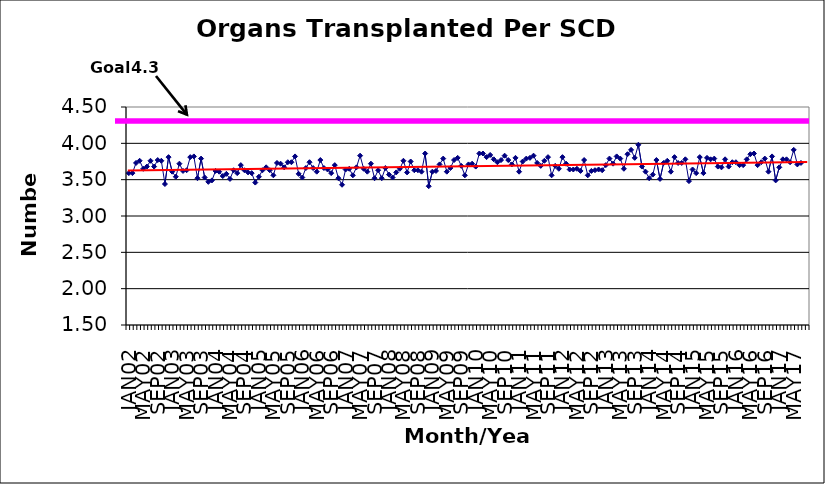
| Category | Series 0 |
|---|---|
| JAN02 | 3.59 |
| FEB02 | 3.59 |
| MAR02 | 3.73 |
| APR02 | 3.76 |
| MAY02 | 3.65 |
| JUN02 | 3.68 |
| JUL02 | 3.76 |
| AUG02 | 3.68 |
| SEP02 | 3.77 |
| OCT02 | 3.76 |
| NOV02 | 3.44 |
| DEC02 | 3.81 |
| JAN03 | 3.61 |
| FEB03 | 3.54 |
| MAR03 | 3.72 |
| APR03 | 3.62 |
| MAY03 | 3.63 |
| JUN03 | 3.81 |
| JUL03 | 3.82 |
| AUG03 | 3.52 |
| SEP03 | 3.79 |
| OCT03 | 3.53 |
| NOV03 | 3.47 |
| DEC03 | 3.49 |
| JAN04 | 3.62 |
| FEB04 | 3.61 |
| MAR04 | 3.55 |
| APR04 | 3.58 |
| MAY04 | 3.51 |
| JUN04 | 3.63 |
| JUL04 | 3.59 |
| AUG04 | 3.7 |
| SEP04 | 3.63 |
| OCT04 | 3.6 |
| NOV04 | 3.59 |
| DEC04 | 3.46 |
| JAN05 | 3.54 |
| FEB05 | 3.63 |
| MAR05 | 3.67 |
| APR05 | 3.63 |
| MAY05 | 3.56 |
| JUN05 | 3.73 |
| JUL05 | 3.72 |
| AUG05 | 3.67 |
| SEP05 | 3.74 |
| OCT05 | 3.74 |
| NOV05 | 3.82 |
| DEC05 | 3.58 |
| JAN06 | 3.53 |
| FEB06 | 3.66 |
| MAR06 | 3.74 |
| APR06 | 3.66 |
| MAY06 | 3.61 |
| JUN06 | 3.77 |
| JUL06 | 3.66 |
| AUG06 | 3.64 |
| SEP06 | 3.59 |
| OCT06 | 3.7 |
| NOV06 | 3.52 |
| DEC06 | 3.43 |
| JAN07 | 3.64 |
| FEB07 | 3.65 |
| MAR07 | 3.56 |
| APR07 | 3.67 |
| MAY07 | 3.83 |
| JUN07 | 3.65 |
| JUL07 | 3.61 |
| AUG07 | 3.72 |
| SEP07 | 3.52 |
| OCT07 | 3.63 |
| NOV07 | 3.52 |
| DEC07 | 3.66 |
| JAN08 | 3.57 |
| FEB08 | 3.53 |
| MAR08 | 3.6 |
| APR08 | 3.65 |
| MAY08 | 3.76 |
| JUN08 | 3.6 |
| JUL08 | 3.75 |
| AUG08 | 3.63 |
| SEP08 | 3.63 |
| OCT08 | 3.61 |
| NOV08 | 3.86 |
| DEC08 | 3.41 |
| JAN09 | 3.61 |
| FEB09 | 3.62 |
| MAR09 | 3.71 |
| APR09 | 3.79 |
| MAY09 | 3.61 |
| JUN09 | 3.66 |
| JUL09 | 3.77 |
| AUG09 | 3.8 |
| SEP09 | 3.69 |
| OCT09 | 3.56 |
| NOV09 | 3.71 |
| DEC09 | 3.72 |
| JAN10 | 3.68 |
| FEB10 | 3.86 |
| MAR10 | 3.86 |
| APR10 | 3.81 |
| MAY10 | 3.84 |
| JUN10 | 3.78 |
| JUL10 | 3.74 |
| AUG10 | 3.77 |
| SEP10 | 3.83 |
| OCT10 | 3.77 |
| NOV10 | 3.71 |
| DEC10 | 3.8 |
| JAN11 | 3.61 |
| FEB11 | 3.75 |
| MAR11 | 3.79 |
| APR11 | 3.8 |
| MAY11 | 3.83 |
| JUN11 | 3.73 |
| JUL11 | 3.69 |
| AUG11 | 3.76 |
| SEP11 | 3.81 |
| OCT11 | 3.56 |
| NOV11 | 3.69 |
| DEC11 | 3.65 |
| JAN12 | 3.81 |
| FEB12 | 3.72 |
| MAR12 | 3.64 |
| APR12 | 3.64 |
| MAY12 | 3.65 |
| JUN12 | 3.62 |
| JUL12 | 3.77 |
| AUG12 | 3.56 |
| SEP12 | 3.62 |
| OCT12 | 3.63 |
| NOV12 | 3.64 |
| DEC12 | 3.63 |
| JAN13 | 3.7 |
| FEB13 | 3.79 |
| MAR13 | 3.72 |
| APR13 | 3.82 |
| MAY13 | 3.79 |
| JUN13 | 3.65 |
| JUL13 | 3.85 |
| AUG13 | 3.91 |
| SEP13 | 3.8 |
| OCT13 | 3.98 |
| NOV13 | 3.68 |
| DEC13 | 3.61 |
| JAN14 | 3.52 |
| FEB14 | 3.57 |
| MAR14 | 3.77 |
| APR14 | 3.51 |
| MAY14 | 3.73 |
| JUN14 | 3.76 |
| JUL14 | 3.61 |
| AUG14 | 3.81 |
| SEP14 | 3.73 |
| OCT14 | 3.73 |
| NOV14 | 3.78 |
| DEC14 | 3.48 |
| JAN15 | 3.64 |
| FEB15 | 3.59 |
| MAR15 | 3.81 |
| APR15 | 3.59 |
| MAY15 | 3.8 |
| JUN15 | 3.78 |
| JUL15 | 3.79 |
| AUG15 | 3.68 |
| SEP15 | 3.67 |
| OCT15 | 3.78 |
| NOV15 | 3.68 |
| DEC15 | 3.74 |
| JAN16 | 3.74 |
| FEB16 | 3.7 |
| MAR16 | 3.7 |
| APR16 | 3.78 |
| MAY16 | 3.85 |
| JUN16 | 3.86 |
| JUL16 | 3.7 |
| AUG16 | 3.74 |
| SEP16 | 3.79 |
| OCT16 | 3.61 |
| NOV16 | 3.82 |
| DEC16 | 3.49 |
| JAN17 | 3.67 |
| FEB17 | 3.78 |
| MAR17 | 3.78 |
| APR17 | 3.74 |
| MAY17 | 3.91 |
| JUN17 | 3.71 |
| JUL17 | 3.73 |